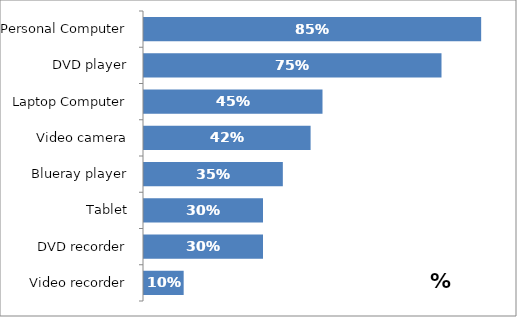
| Category | % Ownership |
|---|---|
| Video recorder | 0.1 |
| DVD recorder | 0.3 |
| Tablet | 0.3 |
| Blueray player | 0.35 |
| Video camera | 0.42 |
| Laptop Computer | 0.45 |
| DVD player | 0.75 |
| Personal Computer | 0.85 |